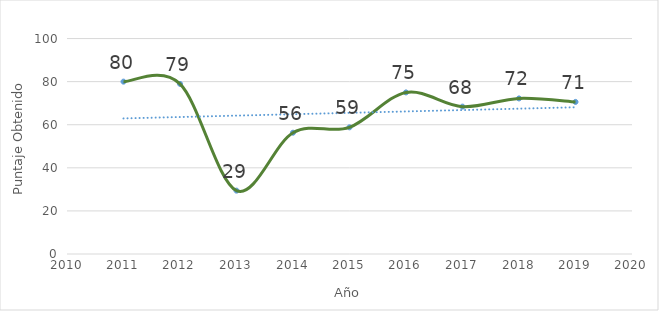
| Category | Control interno |
|---|---|
| 2011.0 | 80 |
| 2012.0 | 78.95 |
| 2013.0 | 29.41 |
| 2014.0 | 56.3 |
| 2015.0 | 58.8 |
| 2016.0 | 75 |
| 2017.0 | 68.4 |
| 2018.0 | 72.2 |
| 2019.0 | 70.588 |